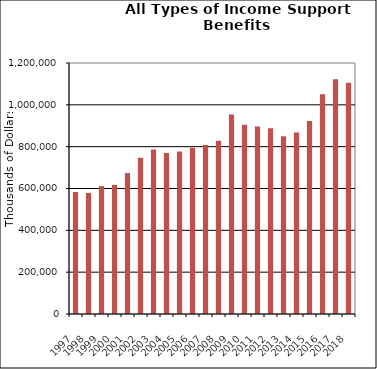
| Category | Series 1 |
|---|---|
| 1997.0 | 583327.23 |
| 1998.0 | 578835.59 |
| 1999.0 | 611295.52 |
| 2000.0 | 616185.55 |
| 2001.0 | 673739.96 |
| 2002.0 | 747230.17 |
| 2003.0 | 786850.56 |
| 2004.0 | 769376.7 |
| 2005.0 | 777369.33 |
| 2006.0 | 795387.49 |
| 2007.0 | 808339.71 |
| 2008.0 | 828662.86 |
| 2009.0 | 954122.04 |
| 2010.0 | 904753.63 |
| 2011.0 | 896414.29 |
| 2012.0 | 887475.74 |
| 2013.0 | 849569.63 |
| 2014.0 | 867723.21 |
| 2015.0 | 922446.84 |
| 2016.0 | 1050551 |
| 2017.0 | 1122515 |
| 2018.0 | 1106108 |